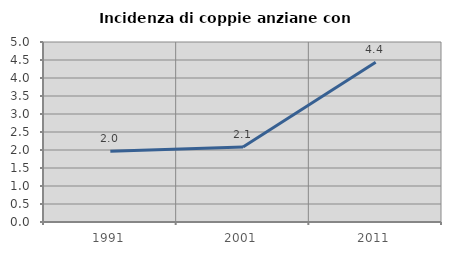
| Category | Incidenza di coppie anziane con figli |
|---|---|
| 1991.0 | 1.966 |
| 2001.0 | 2.083 |
| 2011.0 | 4.438 |